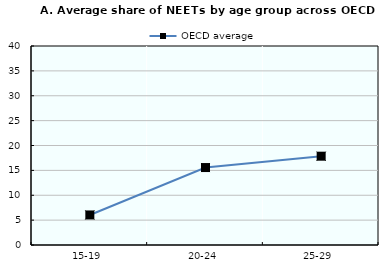
| Category | OECD average |
|---|---|
| 15-19 | 6.04 |
| 20-24 | 15.568 |
| 25-29 | 17.851 |